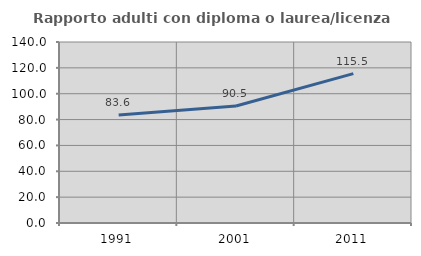
| Category | Rapporto adulti con diploma o laurea/licenza media  |
|---|---|
| 1991.0 | 83.607 |
| 2001.0 | 90.476 |
| 2011.0 | 115.517 |